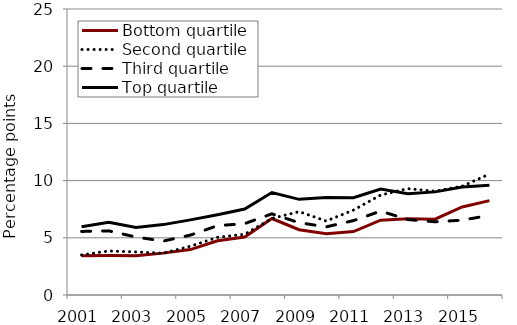
| Category | Bottom quartile | Second quartile | Third quartile | Top quartile |
|---|---|---|---|---|
| 2001.0 | 3.438 | 3.499 | 5.556 | 5.974 |
| 2002.0 | 3.458 | 3.849 | 5.606 | 6.35 |
| 2003.0 | 3.426 | 3.763 | 5.068 | 5.898 |
| 2004.0 | 3.661 | 3.651 | 4.713 | 6.153 |
| 2005.0 | 3.972 | 4.26 | 5.234 | 6.568 |
| 2006.0 | 4.735 | 5.04 | 6.06 | 7.017 |
| 2007.0 | 5.068 | 5.31 | 6.242 | 7.512 |
| 2008.0 | 6.685 | 6.693 | 7.095 | 8.956 |
| 2009.0 | 5.705 | 7.287 | 6.32 | 8.361 |
| 2010.0 | 5.35 | 6.468 | 5.956 | 8.525 |
| 2011.0 | 5.541 | 7.423 | 6.505 | 8.507 |
| 2012.0 | 6.536 | 8.738 | 7.333 | 9.27 |
| 2013.0 | 6.658 | 9.299 | 6.594 | 8.851 |
| 2014.0 | 6.631 | 9.071 | 6.4 | 9.014 |
| 2015.0 | 7.692 | 9.505 | 6.542 | 9.431 |
| 2016.0 | 8.252 | 10.576 | 6.956 | 9.601 |